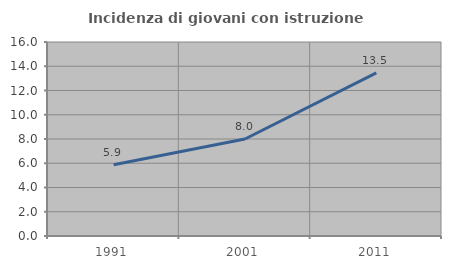
| Category | Incidenza di giovani con istruzione universitaria |
|---|---|
| 1991.0 | 5.877 |
| 2001.0 | 7.998 |
| 2011.0 | 13.456 |